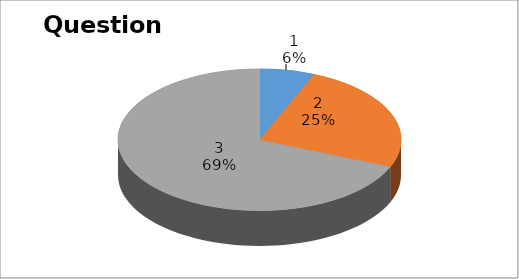
| Category | Series 0 |
|---|---|
| 0 | 2 |
| 1 | 8 |
| 2 | 22 |